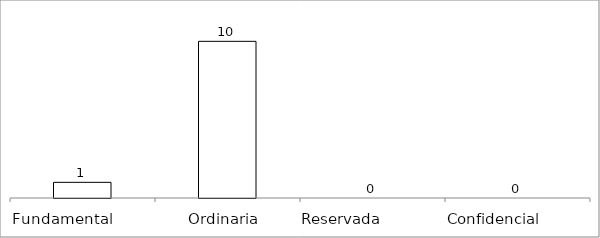
| Category | Series 0 |
|---|---|
| Fundamental         | 1 |
| Ordinaria  | 10 |
| Reservada               | 0 |
| Confidencial             | 0 |